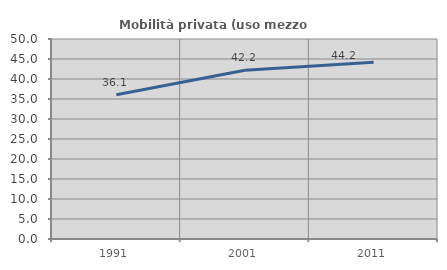
| Category | Mobilità privata (uso mezzo privato) |
|---|---|
| 1991.0 | 36.059 |
| 2001.0 | 42.195 |
| 2011.0 | 44.186 |